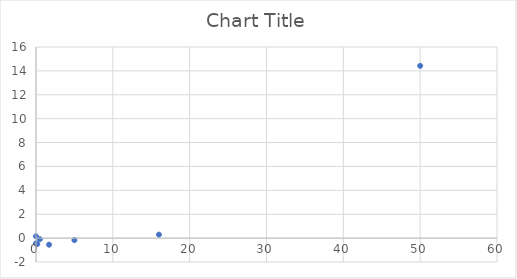
| Category | Series 0 |
|---|---|
| 50.0 | 14.421 |
| 16.0 | 0.291 |
| 5.0 | -0.171 |
| 1.7 | -0.552 |
| 0.5 | -0.089 |
| 0.16 | -0.499 |
| 0.0 | 0.155 |
| 0.0 | -0.44 |